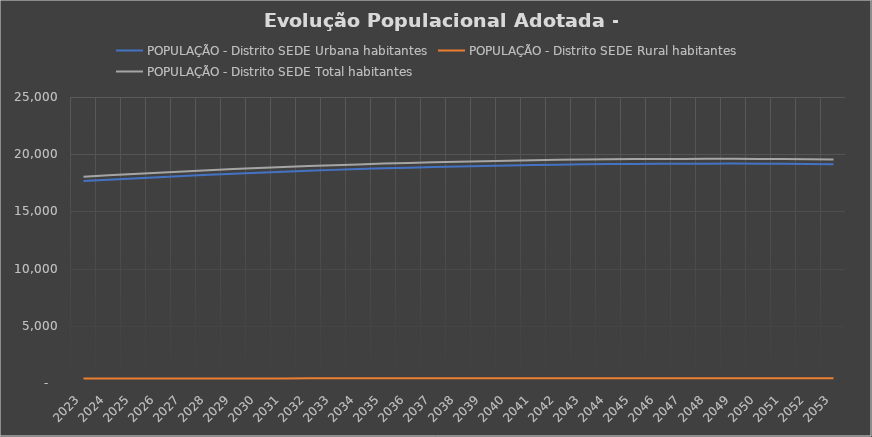
| Category | POPULAÇÃO - Distrito SEDE |
|---|---|
| 2023.0 | 18034.032 |
| 2024.0 | 18156.663 |
| 2025.0 | 18274.682 |
| 2026.0 | 18387.985 |
| 2027.0 | 18496.474 |
| 2028.0 | 18600.054 |
| 2029.0 | 18696.774 |
| 2030.0 | 18790.258 |
| 2031.0 | 18876.693 |
| 2032.0 | 18959.751 |
| 2033.0 | 19037.486 |
| 2034.0 | 19109.828 |
| 2035.0 | 19176.713 |
| 2036.0 | 19238.078 |
| 2037.0 | 19295.792 |
| 2038.0 | 19347.891 |
| 2039.0 | 19394.326 |
| 2040.0 | 19436.994 |
| 2041.0 | 19473.924 |
| 2042.0 | 19505.082 |
| 2043.0 | 19532.389 |
| 2044.0 | 19553.875 |
| 2045.0 | 19571.473 |
| 2046.0 | 19583.216 |
| 2047.0 | 19591.049 |
| 2048.0 | 19594.968 |
| 2049.0 | 19600.846 |
| 2050.0 | 19587.126 |
| 2051.0 | 19575.373 |
| 2052.0 | 19559.713 |
| 2053.0 | 19540.153 |